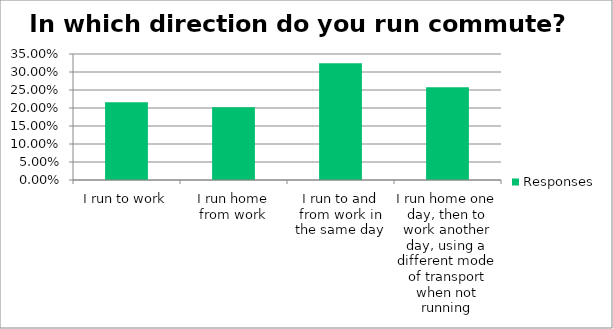
| Category | Responses |
|---|---|
| I run to work | 0.216 |
| I run home from work | 0.202 |
| I run to and from work in the same day | 0.324 |
| I run home one day, then to work another day, using a different mode of transport when not running | 0.258 |